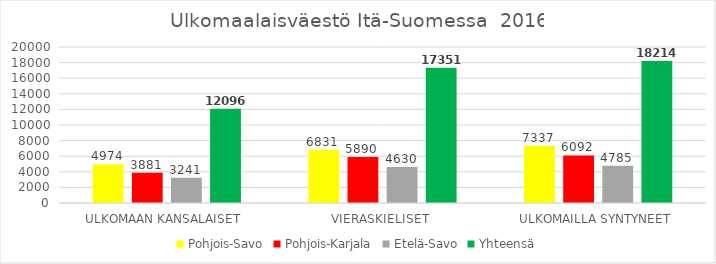
| Category | Pohjois-Savo | Pohjois-Karjala | Etelä-Savo | Yhteensä |
|---|---|---|---|---|
| ULKOMAAN KANSALAISET  | 4974 | 3881 | 3241 | 12096 |
| VIERASKIELISET  | 6831 | 5890 | 4630 | 17351 |
| ULKOMAILLA SYNTYNEET  | 7337 | 6092 | 4785 | 18214 |